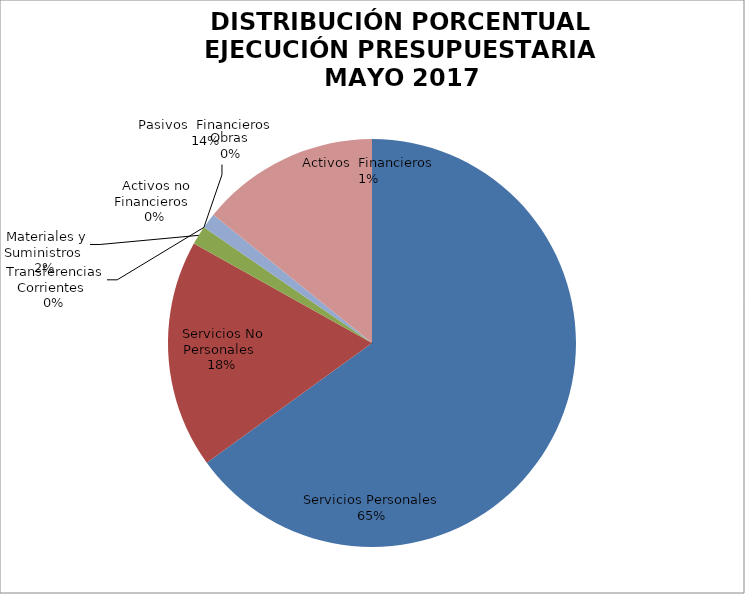
| Category | Series 0 | Series 1 |
|---|---|---|
| Servicios Personales | 11521097.62 | 0.65 |
| Servicios No Personales | 3202794.81 | 0.181 |
| Materiales y Suministros | 263464.19 | 0.015 |
| Transferencias Corrientes | 0 | 0 |
| Activos no Financieros | 0 | 0 |
| Obras | 0 | 0 |
| Activos  Financieros | 217870.05 | 0.012 |
| Pasivos  Financieros | 2512236.29 | 0.142 |